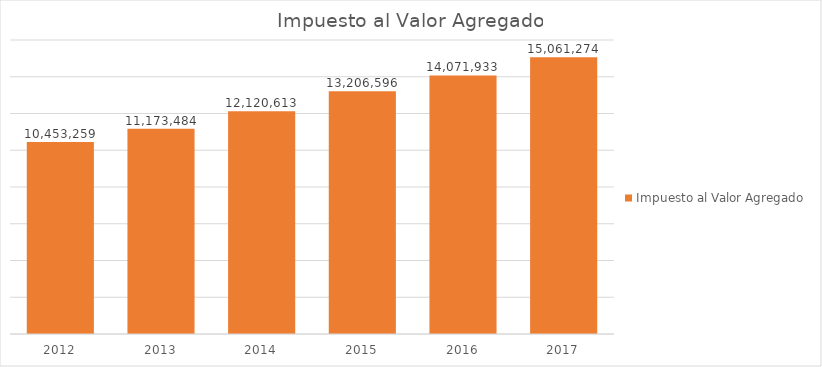
| Category | Impuesto al Valor Agregado |
|---|---|
| 2012.0 | 10453258.63 |
| 2013.0 | 11173483.782 |
| 2014.0 | 12120612.715 |
| 2015.0 | 13206596.238 |
| 2016.0 | 14071932.782 |
| 2017.0 | 15061273.722 |